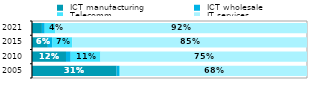
| Category |  ICT manufacturing |  ICT wholesale |  Telecomm. |  IT services |
|---|---|---|---|---|
| 2005.0 | 0.308 | 0.009 | 0.003 | 0.68 |
| 2010.0 | 0.124 | 0.017 | 0.108 | 0.751 |
| 2015.0 | 0.058 | 0.015 | 0.073 | 0.854 |
| 2021.0 | 0.036 | 0.01 | 0.039 | 0.915 |